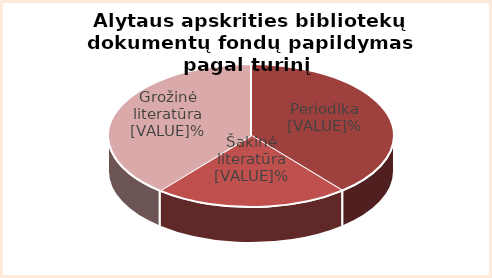
| Category | Series 0 |
|---|---|
| grožinė | 39 |
| šakinė  | 22 |
| periodika | 39 |